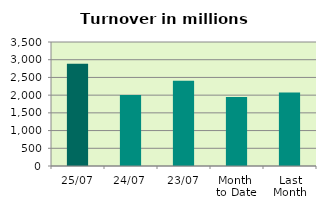
| Category | Series 0 |
|---|---|
| 25/07 | 2888.121 |
| 24/07 | 2004.021 |
| 23/07 | 2404.957 |
| Month 
to Date | 1948.816 |
| Last
Month | 2071.376 |